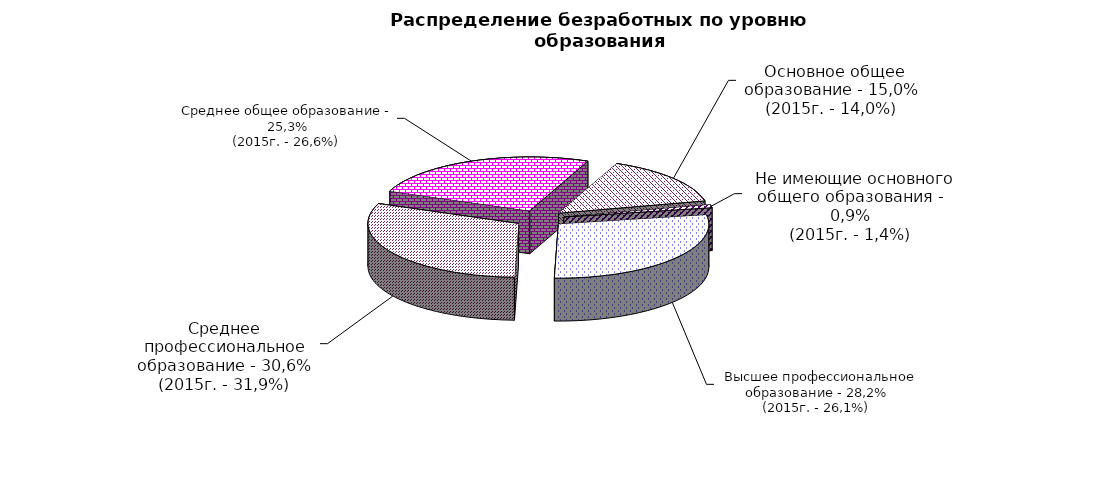
| Category | Series 0 |
|---|---|
|  - высшее профессиональное образование | 28.2 |
|  - среднее профессиональное образование | 30.6 |
|  - среднее общее образование | 25.3 |
|  - основное общее образование | 15 |
|  - не имеющие основного общего образования | 0.9 |